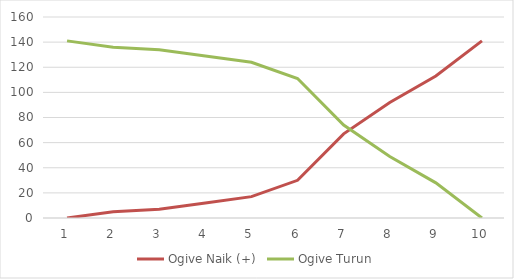
| Category | Ogive Naik (+) | Ogive Turun |
|---|---|---|
| 0 | 0 | 141 |
| 1 | 5 | 136 |
| 2 | 7 | 134 |
| 3 | 12 | 129 |
| 4 | 17 | 124 |
| 5 | 30 | 111 |
| 6 | 67 | 74 |
| 7 | 92 | 49 |
| 8 | 113 | 28 |
| 9 | 141 | 0 |